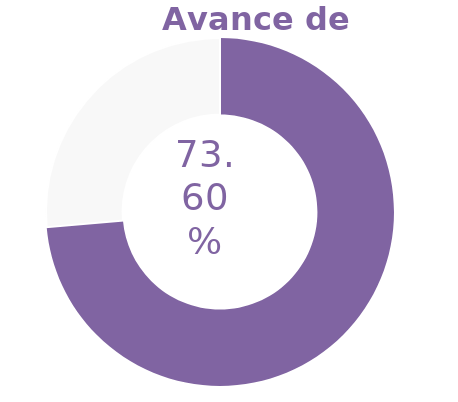
| Category | Series 0 |
|---|---|
| Acumulado 1 Trimestre | 0.736 |
| Año | -0.264 |